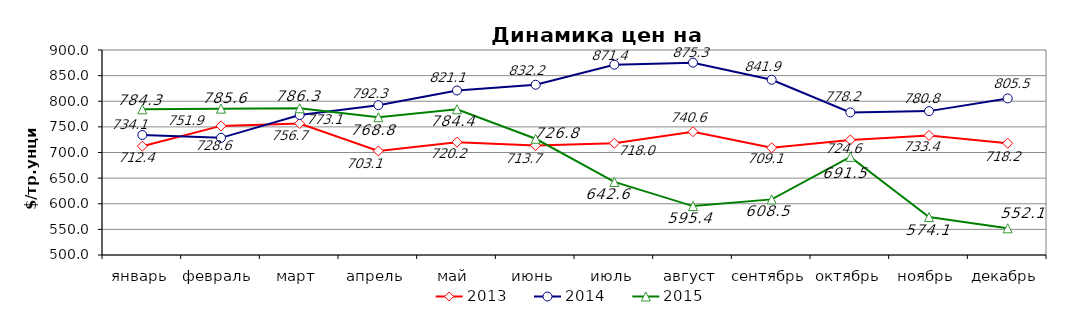
| Category | 2013 | 2014 | 2015 |
|---|---|---|---|
| январь | 712.36 | 734.14 | 784.33 |
| февраль | 751.93 | 728.55 | 785.55 |
| март | 756.65 | 773.07 | 786.32 |
| апрель | 703.05 | 792.33 | 768.8 |
| май | 720.19 | 821.05 | 784.42 |
| июнь | 713.68 | 832.19 | 726.77 |
| июль | 718.02 | 871.36 | 642.57 |
| август | 740.57 | 875.32 | 595.4 |
| сентябрь | 709.14 | 841.88 | 608.5 |
| октябрь | 724.61 | 778.24 | 691.5 |
| ноябрь | 733.36 | 780.75 | 574.05 |
| декабрь | 718.2 | 805.52 | 552.05 |